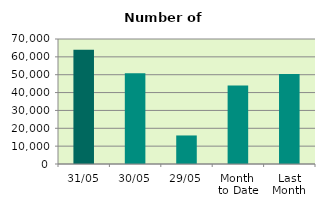
| Category | Series 0 |
|---|---|
| 31/05 | 64012 |
| 30/05 | 50782 |
| 29/05 | 15982 |
| Month 
to Date | 44009.364 |
| Last
Month | 50445.556 |